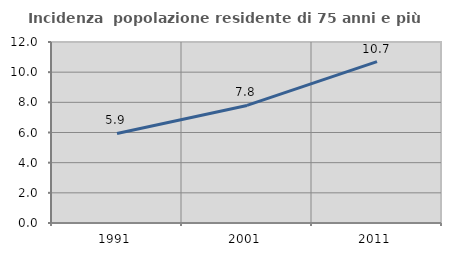
| Category | Incidenza  popolazione residente di 75 anni e più |
|---|---|
| 1991.0 | 5.937 |
| 2001.0 | 7.796 |
| 2011.0 | 10.698 |